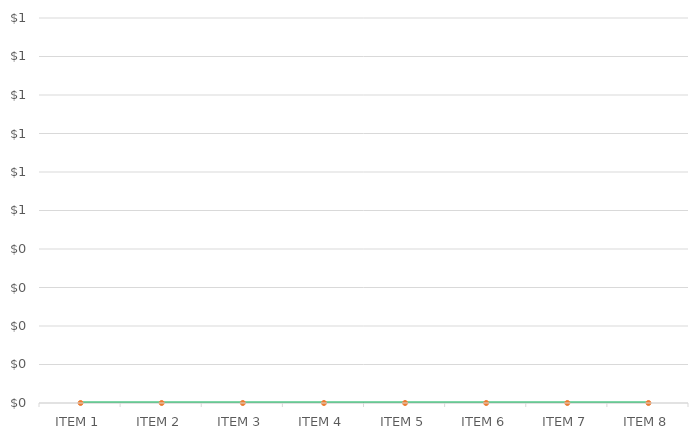
| Category | Series 1 |
|---|---|
| ITEM 1 | 0 |
| ITEM 2 | 0 |
| ITEM 3 | 0 |
| ITEM 4 | 0 |
| ITEM 5 | 0 |
| ITEM 6 | 0 |
| ITEM 7 | 0 |
| ITEM 8 | 0 |